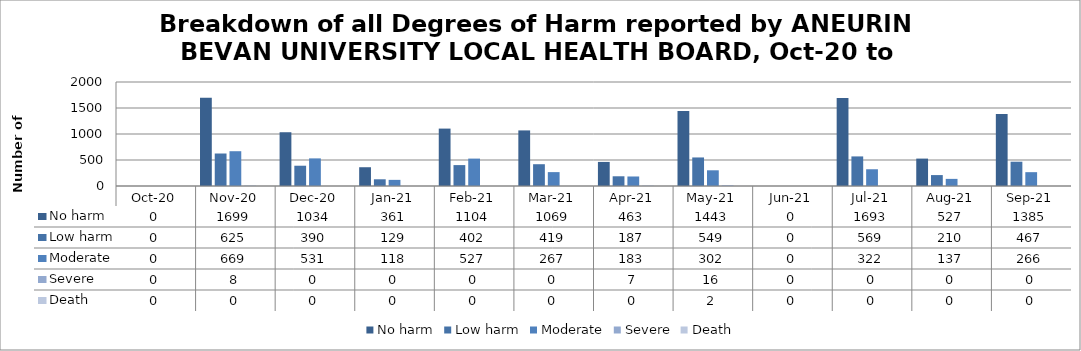
| Category | No harm | Low harm | Moderate | Severe | Death |
|---|---|---|---|---|---|
| Oct-20 | 0 | 0 | 0 | 0 | 0 |
| Nov-20 | 1699 | 625 | 669 | 8 | 0 |
| Dec-20 | 1034 | 390 | 531 | 0 | 0 |
| Jan-21 | 361 | 129 | 118 | 0 | 0 |
| Feb-21 | 1104 | 402 | 527 | 0 | 0 |
| Mar-21 | 1069 | 419 | 267 | 0 | 0 |
| Apr-21 | 463 | 187 | 183 | 7 | 0 |
| May-21 | 1443 | 549 | 302 | 16 | 2 |
| Jun-21 | 0 | 0 | 0 | 0 | 0 |
| Jul-21 | 1693 | 569 | 322 | 0 | 0 |
| Aug-21 | 527 | 210 | 137 | 0 | 0 |
| Sep-21 | 1385 | 467 | 266 | 0 | 0 |